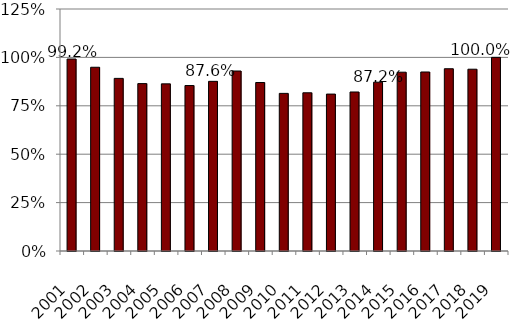
| Category | Series 0 |
|---|---|
| 2001.0 | 0.992 |
| 2002.0 | 0.949 |
| 2003.0 | 0.892 |
| 2004.0 | 0.865 |
| 2005.0 | 0.863 |
| 2006.0 | 0.855 |
| 2007.0 | 0.876 |
| 2008.0 | 0.93 |
| 2009.0 | 0.87 |
| 2010.0 | 0.814 |
| 2011.0 | 0.817 |
| 2012.0 | 0.81 |
| 2013.0 | 0.821 |
| 2014.0 | 0.872 |
| 2015.0 | 0.924 |
| 2016.0 | 0.925 |
| 2017.0 | 0.941 |
| 2018.0 | 0.939 |
| 2019.0 | 1 |